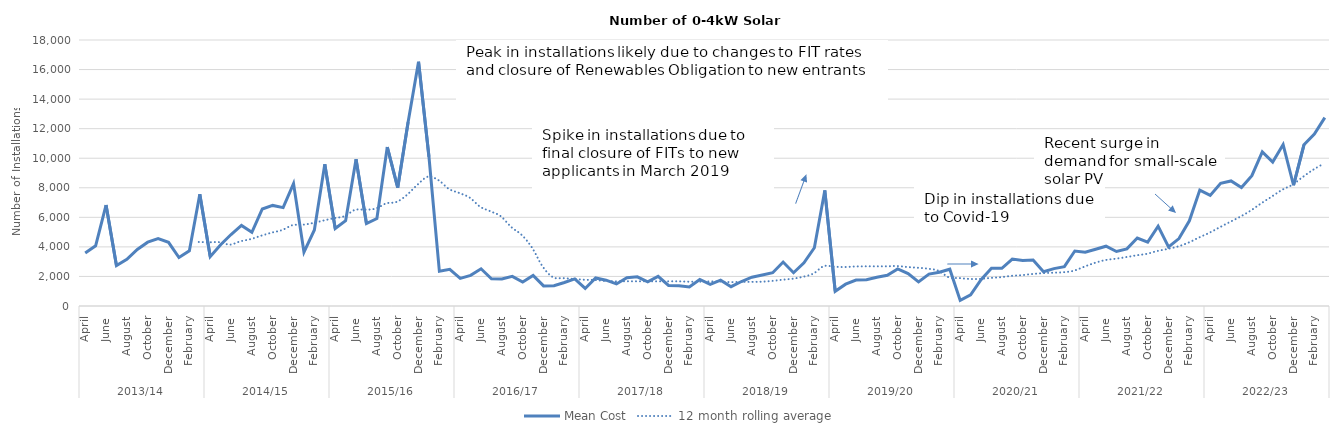
| Category | Mean Cost |
|---|---|
| 0 | 3582 |
| 1 | 4075 |
| 2 | 6833 |
| 3 | 2741 |
| 4 | 3159 |
| 5 | 3830 |
| 6 | 4321 |
| 7 | 4562 |
| 8 | 4311 |
| 9 | 3281 |
| 10 | 3736 |
| 11 | 7556 |
| 12 | 3342 |
| 13 | 4151 |
| 14 | 4837 |
| 15 | 5448 |
| 16 | 4984 |
| 17 | 6565 |
| 18 | 6806 |
| 19 | 6656 |
| 20 | 8284 |
| 21 | 3650 |
| 22 | 5146 |
| 23 | 9591 |
| 24 | 5241 |
| 25 | 5775 |
| 26 | 9928 |
| 27 | 5575 |
| 28 | 5923 |
| 29 | 10757 |
| 30 | 8007 |
| 31 | 12454 |
| 32 | 16528 |
| 33 | 10102 |
| 34 | 2347 |
| 35 | 2485 |
| 36 | 1873 |
| 37 | 2072 |
| 38 | 2518 |
| 39 | 1844 |
| 40 | 1823 |
| 41 | 2007 |
| 42 | 1623 |
| 43 | 2070 |
| 44 | 1361 |
| 45 | 1370 |
| 46 | 1589 |
| 47 | 1837 |
| 48 | 1186 |
| 49 | 1898 |
| 50 | 1745 |
| 51 | 1491 |
| 52 | 1918 |
| 53 | 1975 |
| 54 | 1635 |
| 55 | 2006 |
| 56 | 1390 |
| 57 | 1378 |
| 58 | 1293 |
| 59 | 1793 |
| 60 | 1465 |
| 61 | 1747 |
| 62 | 1308 |
| 63 | 1656 |
| 64 | 1949 |
| 65 | 2096 |
| 66 | 2250 |
| 67 | 2973 |
| 68 | 2250 |
| 69 | 2918 |
| 70 | 3940 |
| 71 | 7818 |
| 72 | 998 |
| 73 | 1478 |
| 74 | 1760 |
| 75 | 1783 |
| 76 | 1948 |
| 77 | 2083 |
| 78 | 2513 |
| 79 | 2189 |
| 80 | 1635 |
| 81 | 2158 |
| 82 | 2286 |
| 83 | 2491 |
| 84 | 377 |
| 85 | 758 |
| 86 | 1781 |
| 87 | 2562 |
| 88 | 2554 |
| 89 | 3177 |
| 90 | 3084 |
| 91 | 3109 |
| 92 | 2318 |
| 93 | 2529 |
| 94 | 2666 |
| 95 | 3723 |
| 96 | 3633 |
| 97 | 3836 |
| 98 | 4047 |
| 99 | 3688 |
| 100 | 3864 |
| 101 | 4597 |
| 102 | 4325 |
| 103 | 5400 |
| 104 | 3994 |
| 105 | 4563 |
| 106 | 5767 |
| 107 | 7845 |
| 108 | 7481 |
| 109 | 8307 |
| 110 | 8461 |
| 111 | 8012 |
| 112 | 8818 |
| 113 | 10434 |
| 114 | 9743 |
| 115 | 10927 |
| 116 | 8171 |
| 117 | 10908 |
| 118 | 11638 |
| 119 | 12748 |